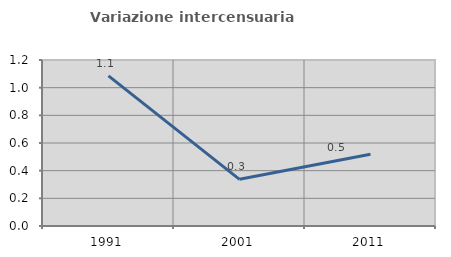
| Category | Variazione intercensuaria annua |
|---|---|
| 1991.0 | 1.085 |
| 2001.0 | 0.337 |
| 2011.0 | 0.519 |